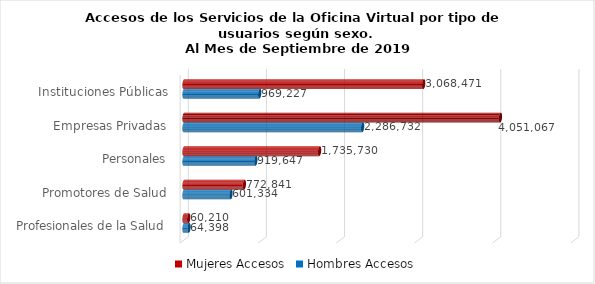
| Category | Mujeres | Hombres |
|---|---|---|
| Instituciones Públicas | 3068471 | 969227 |
| Empresas Privadas | 4051067 | 2286732 |
| Personales | 1735730 | 919647 |
| Promotores de Salud | 772841 | 601334 |
| Profesionales de la Salud | 60210 | 64398 |